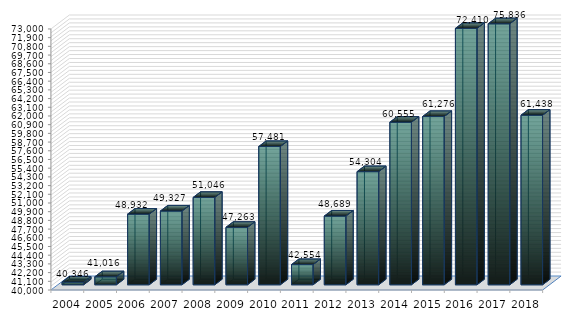
| Category | 2004 2005 2006 2007 2008 2009 2010 2011 2012 2013 2014 2015 2016 2017 2018 |
|---|---|
| 2004.0 | 40346 |
| 2005.0 | 41016 |
| 2006.0 | 48932 |
| 2007.0 | 49327 |
| 2008.0 | 51046 |
| 2009.0 | 47263 |
| 2010.0 | 57481 |
| 2011.0 | 42554 |
| 2012.0 | 48689 |
| 2013.0 | 54304 |
| 2014.0 | 60555 |
| 2015.0 | 61276 |
| 2016.0 | 72410 |
| 2017.0 | 75836 |
| 2018.0 | 61438 |